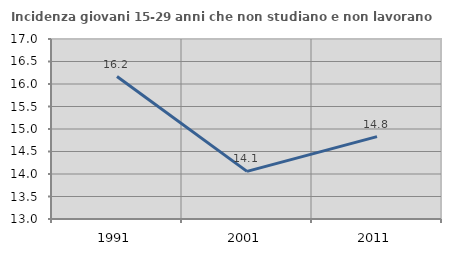
| Category | Incidenza giovani 15-29 anni che non studiano e non lavorano  |
|---|---|
| 1991.0 | 16.165 |
| 2001.0 | 14.058 |
| 2011.0 | 14.83 |